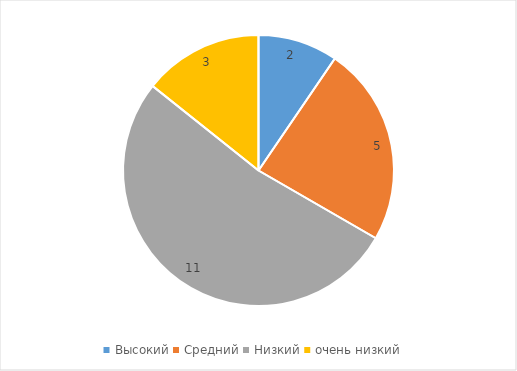
| Category | Series 0 |
|---|---|
| Высокий | 2 |
| Средний | 5 |
| Низкий | 11 |
| очень низкий | 3 |